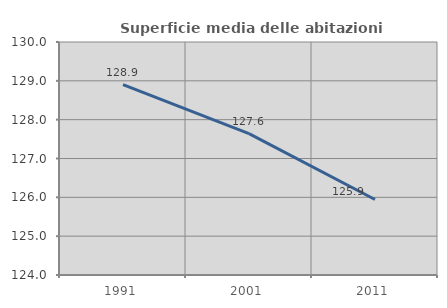
| Category | Superficie media delle abitazioni occupate |
|---|---|
| 1991.0 | 128.905 |
| 2001.0 | 127.64 |
| 2011.0 | 125.943 |